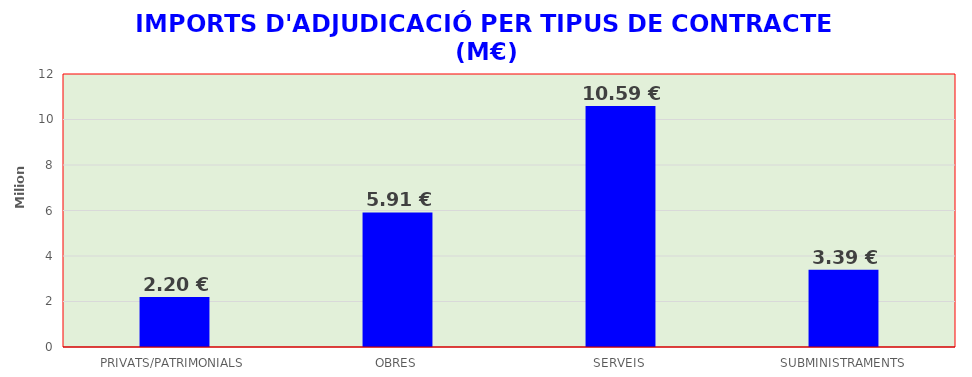
| Category | Series 0 |
|---|---|
| PRIVATS/PATRIMONIALS | 2201760.18 |
| OBRES | 5914714.01 |
| SERVEIS | 10593782.71 |
| SUBMINISTRAMENTS | 3391346.73 |